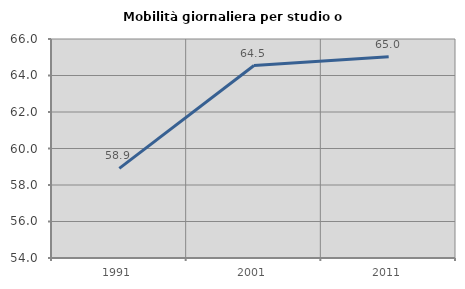
| Category | Mobilità giornaliera per studio o lavoro |
|---|---|
| 1991.0 | 58.908 |
| 2001.0 | 64.544 |
| 2011.0 | 65.028 |